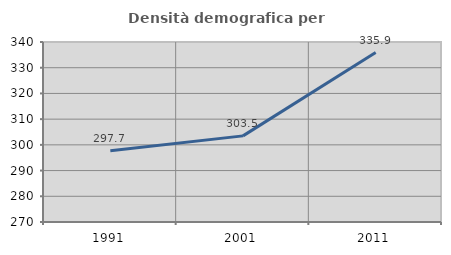
| Category | Densità demografica |
|---|---|
| 1991.0 | 297.716 |
| 2001.0 | 303.496 |
| 2011.0 | 335.88 |